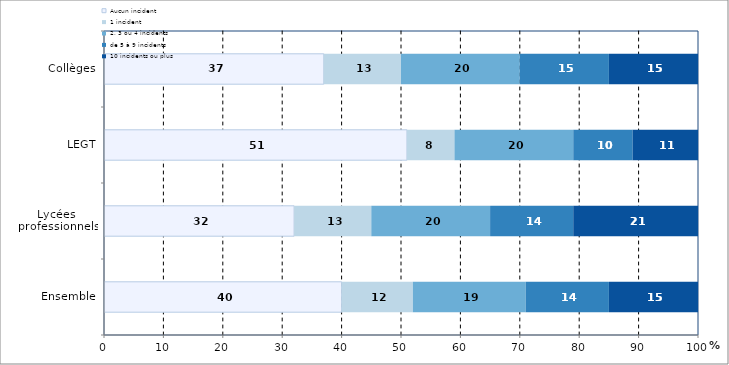
| Category | Aucun incident | 1 incident | 2, 3 ou 4 incidents | de 5 à 9 incidents  | 10 incidents ou plus  |
|---|---|---|---|---|---|
| Ensemble | 40 | 12 | 19 | 14 | 15 |
| Lycées 
professionnels | 32 | 13 | 20 | 14 | 21 |
| LEGT | 51 | 8 | 20 | 10 | 11 |
| Collèges | 37 | 13 | 20 | 15 | 15 |